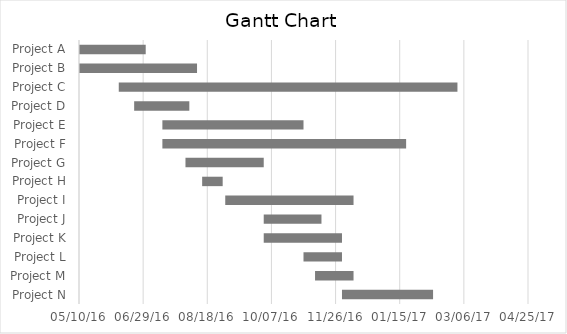
| Category | Start Date | Duration |
|---|---|---|
| Project A | 2016-05-05 | 57 |
| Project B | 2016-05-10 | 92 |
| Project C | 2016-06-10 | 264 |
| Project D | 2016-06-22 | 43 |
| Project E | 2016-07-14 | 110 |
| Project F | 2016-07-14 | 190 |
| Project G | 2016-08-01 | 61 |
| Project H | 2016-08-14 | 16 |
| Project I | 2016-09-01 | 100 |
| Project J | 2016-10-01 | 45 |
| Project K | 2016-10-01 | 61 |
| Project L | 2016-11-01 | 30 |
| Project M | 2016-11-10 | 30 |
| Project N | 2016-12-01 | 71 |